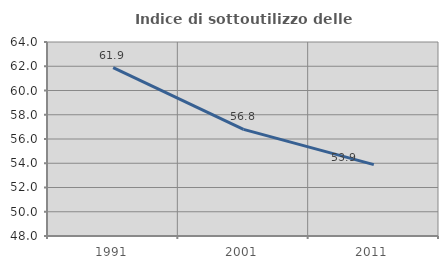
| Category | Indice di sottoutilizzo delle abitazioni  |
|---|---|
| 1991.0 | 61.881 |
| 2001.0 | 56.796 |
| 2011.0 | 53.886 |